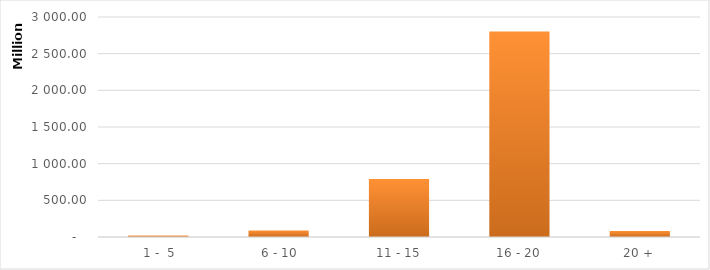
| Category | Series 0 |
|---|---|
|  1 -  5 | 21096147.43 |
|  6 - 10 | 90168068.43 |
| 11 - 15 | 790469502.73 |
| 16 - 20 | 2802198139.78 |
| 20 + | 80463164.12 |